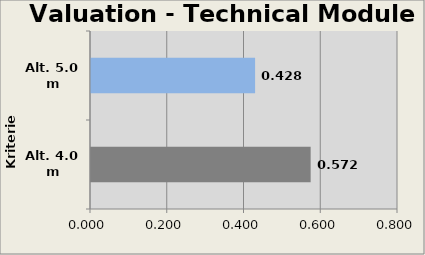
| Category | Valuation Technical Module  |
|---|---|
| Alt. 4.0 m | 0.572 |
| Alt. 5.0 m | 0.428 |